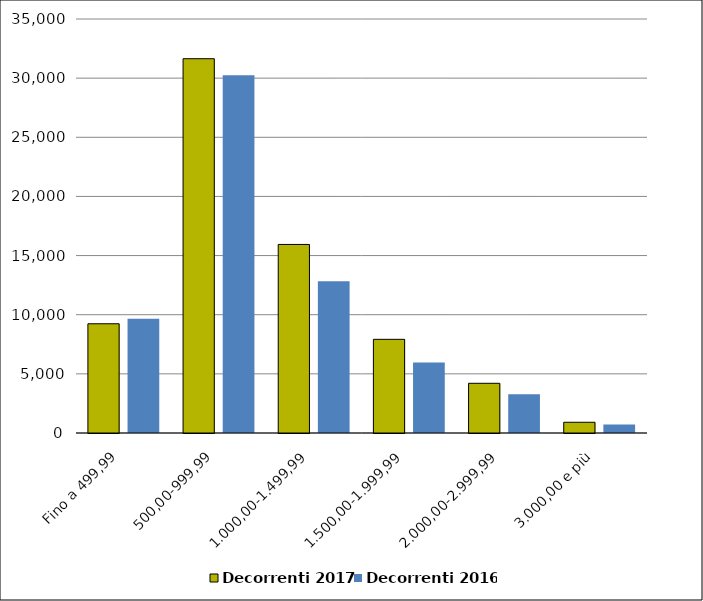
| Category | Decorrenti 2017 | Decorrenti 2016 |
|---|---|---|
| Fino a 499,99 | 9235 | 9649 |
| 500,00-999,99 | 31643 | 30239 |
| 1.000,00-1.499,99 | 15940 | 12830 |
| 1.500,00-1.999,99 | 7919 | 5970 |
| 2.000,00-2.999,99 | 4203 | 3283 |
| 3.000,00 e più | 907 | 722 |